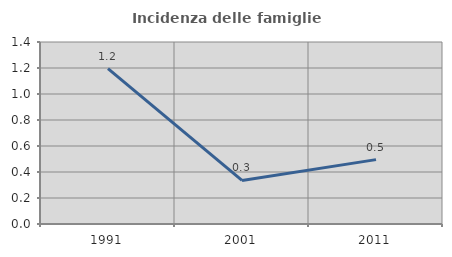
| Category | Incidenza delle famiglie numerose |
|---|---|
| 1991.0 | 1.196 |
| 2001.0 | 0.335 |
| 2011.0 | 0.495 |